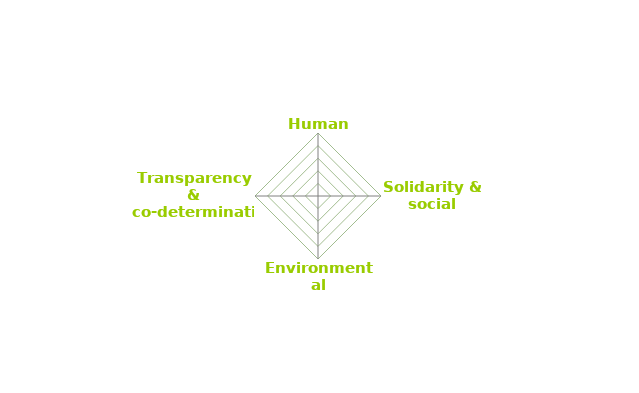
| Category | Series 0 |
|---|---|
| Human dignity | 0 |
| Solidarity & social justice | 0 |
| Environmental sustainability | 0 |
| Transparency & co-determination | 0 |